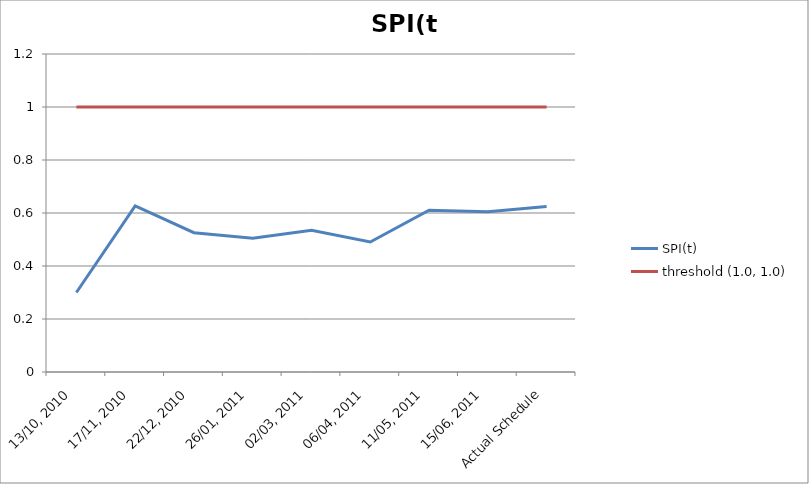
| Category | SPI(t) | threshold (1.0, 1.0) |
|---|---|---|
| 13/10, 2010 | 0.3 | 1 |
| 17/11, 2010 | 0.627 | 1 |
| 22/12, 2010 | 0.526 | 1 |
| 26/01, 2011 | 0.504 | 1 |
| 02/03, 2011 | 0.535 | 1 |
| 06/04, 2011 | 0.49 | 1 |
| 11/05, 2011 | 0.611 | 1 |
| 15/06, 2011 | 0.605 | 1 |
| Actual Schedule | 0.624 | 1 |